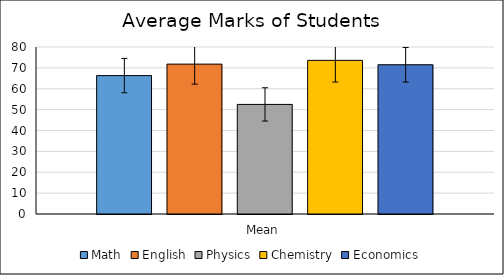
| Category | Math | English | Physics | Chemistry | Economics |
|---|---|---|---|---|---|
| Mean | 66.3 | 71.8 | 52.5 | 73.6 | 71.5 |